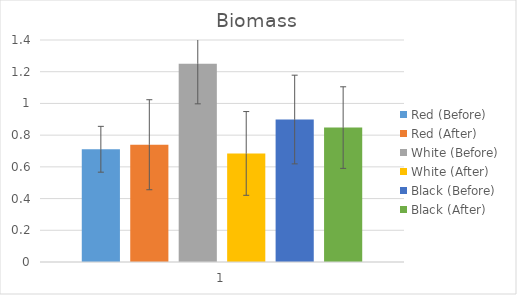
| Category | Red (Before) | Red (After) | White (Before) | White (After) | Black (Before) | Black (After) |
|---|---|---|---|---|---|---|
| 0 | 0.711 | 0.74 | 1.25 | 0.685 | 0.899 | 0.848 |